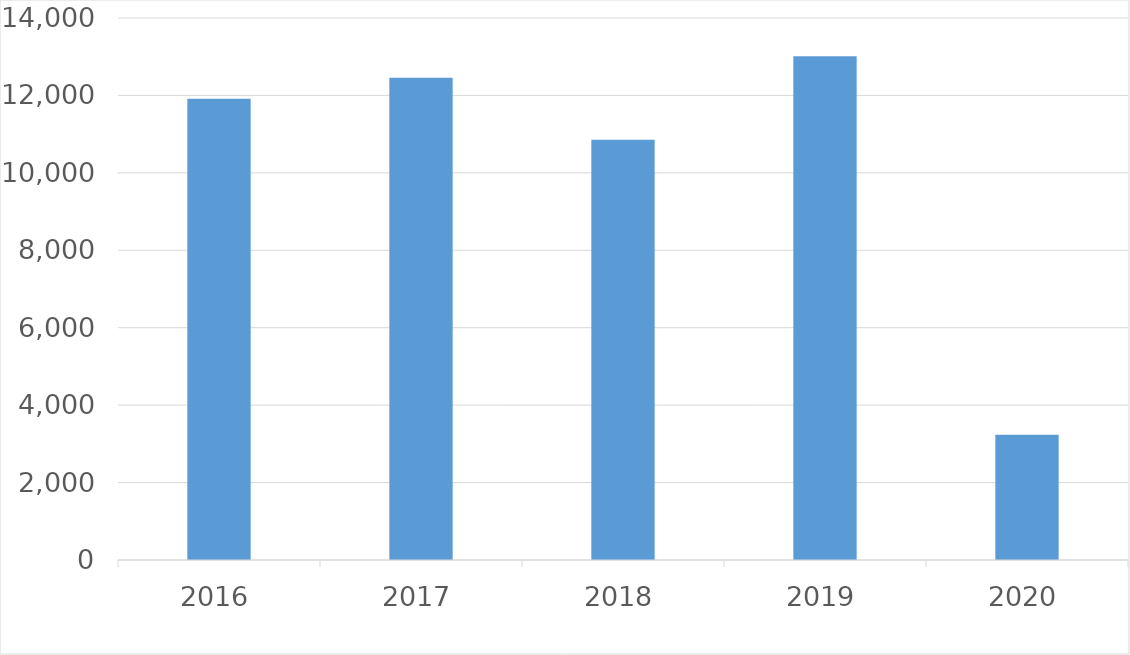
| Category | Series 0 |
|---|---|
| 2016 | 11913 |
| 2017 | 12454 |
| 2018 | 10856 |
| 2019 | 13014 |
| 2020 | 3234 |